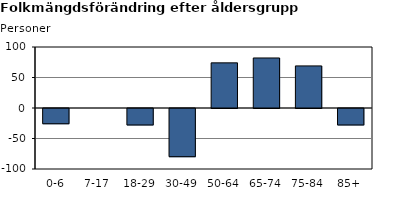
| Category | Series 2 |
|---|---|
| 0-6 | -25 |
| 7-17 | 0 |
| 18-29 | -27 |
| 30-49 | -79 |
| 50-64 | 74 |
| 65-74 | 82 |
| 75-84 | 69 |
| 85+ | -27 |